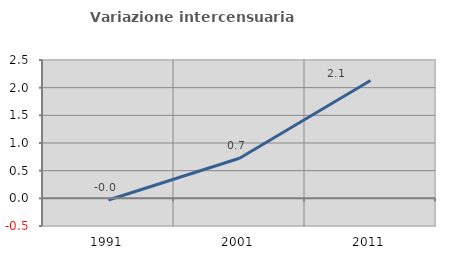
| Category | Variazione intercensuaria annua |
|---|---|
| 1991.0 | -0.03 |
| 2001.0 | 0.724 |
| 2011.0 | 2.128 |